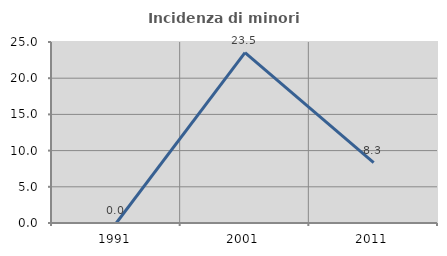
| Category | Incidenza di minori stranieri |
|---|---|
| 1991.0 | 0 |
| 2001.0 | 23.529 |
| 2011.0 | 8.333 |